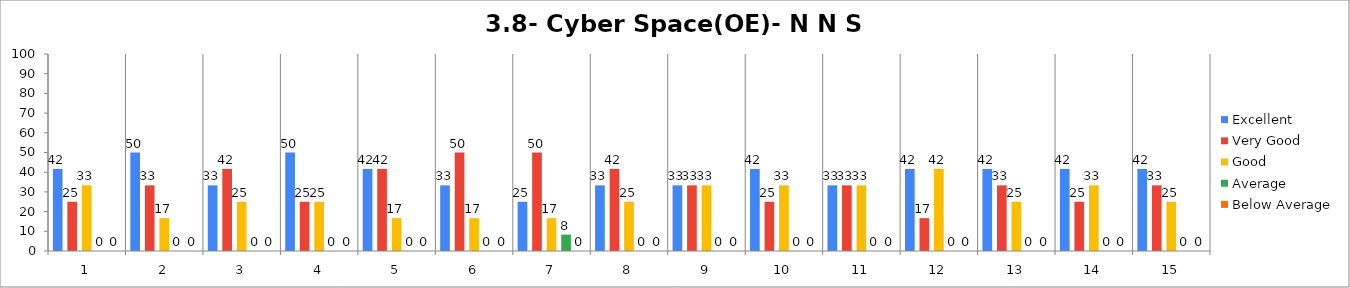
| Category | Excellent | Very Good | Good | Average | Below Average |
|---|---|---|---|---|---|
| 0 | 41.667 | 25 | 33.333 | 0 | 0 |
| 1 | 50 | 33.333 | 16.667 | 0 | 0 |
| 2 | 33.333 | 41.667 | 25 | 0 | 0 |
| 3 | 50 | 25 | 25 | 0 | 0 |
| 4 | 41.667 | 41.667 | 16.667 | 0 | 0 |
| 5 | 33.333 | 50 | 16.667 | 0 | 0 |
| 6 | 25 | 50 | 16.667 | 8.333 | 0 |
| 7 | 33.333 | 41.667 | 25 | 0 | 0 |
| 8 | 33.333 | 33.333 | 33.333 | 0 | 0 |
| 9 | 41.667 | 25 | 33.333 | 0 | 0 |
| 10 | 33.333 | 33.333 | 33.333 | 0 | 0 |
| 11 | 41.667 | 16.667 | 41.667 | 0 | 0 |
| 12 | 41.667 | 33.333 | 25 | 0 | 0 |
| 13 | 41.667 | 25 | 33.333 | 0 | 0 |
| 14 | 41.667 | 33.333 | 25 | 0 | 0 |